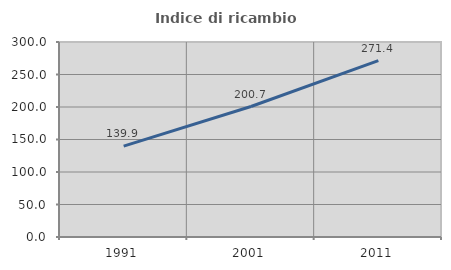
| Category | Indice di ricambio occupazionale  |
|---|---|
| 1991.0 | 139.903 |
| 2001.0 | 200.747 |
| 2011.0 | 271.383 |